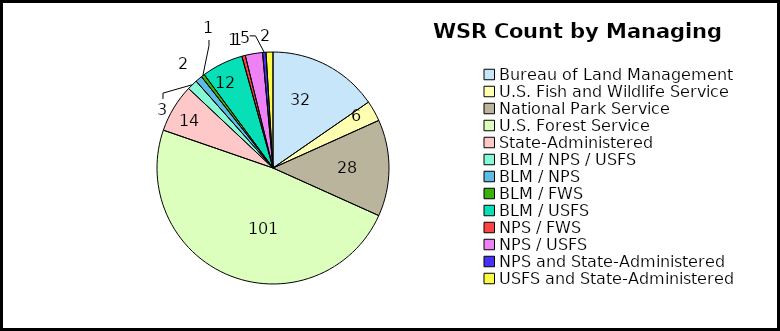
| Category | River Count |
|---|---|
| Bureau of Land Management | 32 |
| U.S. Fish and Wildlife Service | 6 |
| National Park Service | 28 |
| U.S. Forest Service | 101 |
| State-Administered | 14 |
| BLM / NPS / USFS | 3 |
| BLM / NPS | 2 |
| BLM / FWS | 1 |
| BLM / USFS | 12 |
| NPS / FWS | 1 |
| NPS / USFS | 5 |
| NPS and State-Administered | 1 |
| USFS and State-Administered | 2 |